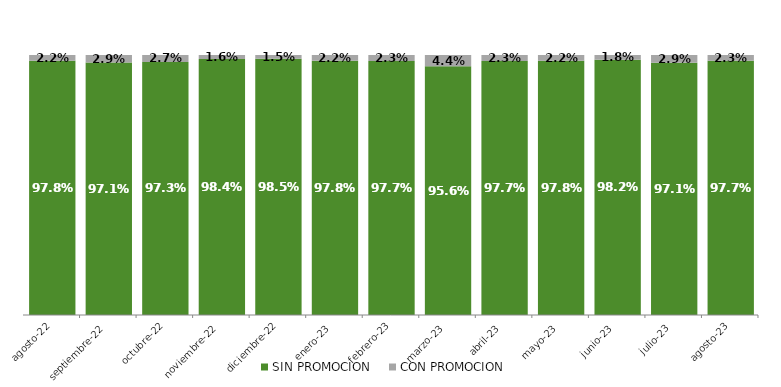
| Category | SIN PROMOCION   | CON PROMOCION   |
|---|---|---|
| 2022-08-01 | 0.978 | 0.022 |
| 2022-09-01 | 0.971 | 0.029 |
| 2022-10-01 | 0.973 | 0.027 |
| 2022-11-01 | 0.984 | 0.016 |
| 2022-12-01 | 0.985 | 0.015 |
| 2023-01-01 | 0.978 | 0.022 |
| 2023-02-01 | 0.977 | 0.023 |
| 2023-03-01 | 0.956 | 0.044 |
| 2023-04-01 | 0.977 | 0.023 |
| 2023-05-01 | 0.978 | 0.022 |
| 2023-06-01 | 0.982 | 0.018 |
| 2023-07-01 | 0.971 | 0.029 |
| 2023-08-01 | 0.977 | 0.023 |